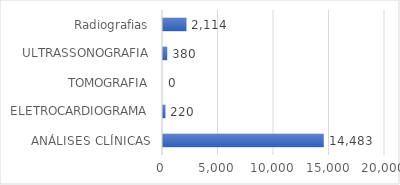
| Category | Series 0 |
|---|---|
| ANÁLISES CLÍNICAS | 14483 |
| ELETROCARDIOGRAMA | 220 |
| TOMOGRAFIA | 0 |
| ULTRASSONOGRAFIA | 380 |
| Radiografias | 2114 |